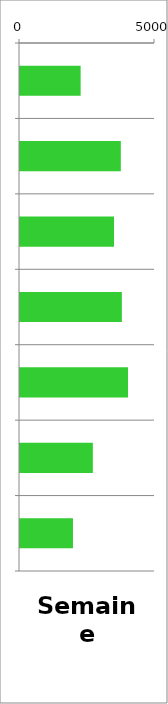
| Category | VL |
|---|---|
| 0 | 2246 |
| 1 | 3734 |
| 2 | 3482 |
| 3 | 3772 |
| 4 | 4000 |
| 5 | 2698 |
| 6 | 1962 |